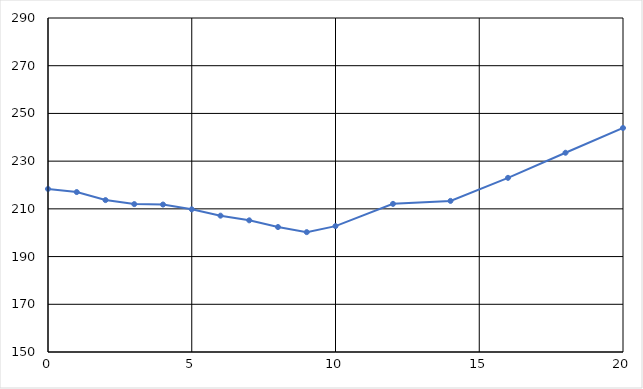
| Category | 218.35 |
|---|---|
| 0.0 | 218.35 |
| 1.0 | 217.036 |
| 2.0 | 213.676 |
| 3.0 | 211.991 |
| 4.0 | 211.809 |
| 5.0 | 209.794 |
| 6.0 | 207.149 |
| 7.0 | 205.186 |
| 8.0 | 202.374 |
| 9.0 | 200.24 |
| 10.0 | 202.77 |
| 12.0 | 212.093 |
| 14.0 | 213.334 |
| 16.0 | 223 |
| 18.0 | 233.519 |
| 20.0 | 243.904 |